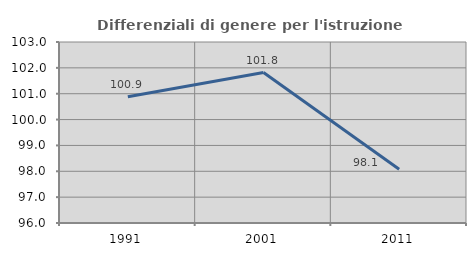
| Category | Differenziali di genere per l'istruzione superiore |
|---|---|
| 1991.0 | 100.886 |
| 2001.0 | 101.817 |
| 2011.0 | 98.08 |